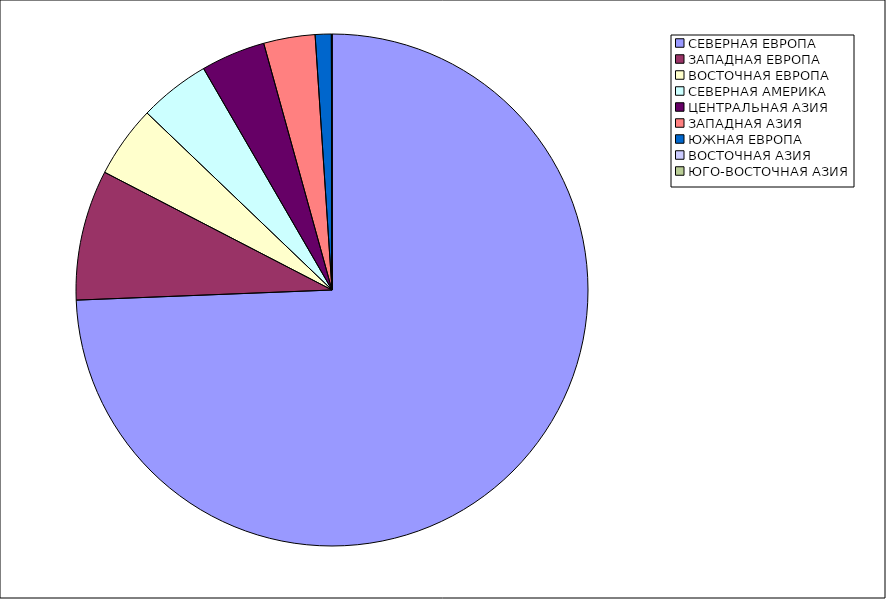
| Category | Оборот |
|---|---|
| СЕВЕРНАЯ ЕВРОПА | 74.368 |
| ЗАПАДНАЯ ЕВРОПА | 8.235 |
| ВОСТОЧНАЯ ЕВРОПА | 4.548 |
| СЕВЕРНАЯ АМЕРИКА | 4.484 |
| ЦЕНТРАЛЬНАЯ АЗИЯ | 4.065 |
| ЗАПАДНАЯ АЗИЯ | 3.245 |
| ЮЖНАЯ ЕВРОПА | 1.013 |
| ВОСТОЧНАЯ АЗИЯ | 0.041 |
| ЮГО-ВОСТОЧНАЯ АЗИЯ | 0 |